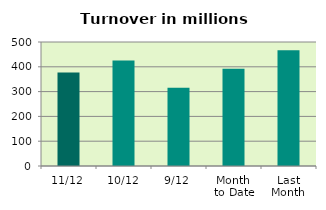
| Category | Series 0 |
|---|---|
| 11/12 | 377.273 |
| 10/12 | 425.71 |
| 9/12 | 315.829 |
| Month 
to Date | 392.527 |
| Last
Month | 466.544 |